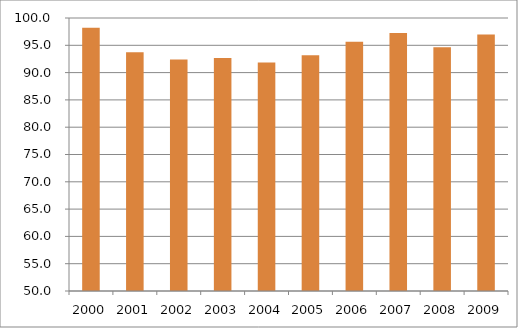
| Category | Região Sudeste |
|---|---|
| 2000.0 | 98.23 |
| 2001.0 | 93.75 |
| 2002.0 | 92.38 |
| 2003.0 | 92.66 |
| 2004.0 | 91.83 |
| 2005.0 | 93.17 |
| 2006.0 | 95.65 |
| 2007.0 | 97.24 |
| 2008.0 | 94.66 |
| 2009.0 | 96.98 |